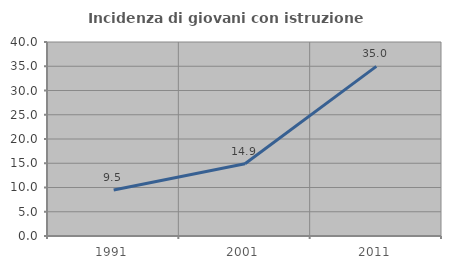
| Category | Incidenza di giovani con istruzione universitaria |
|---|---|
| 1991.0 | 9.497 |
| 2001.0 | 14.907 |
| 2011.0 | 34.965 |